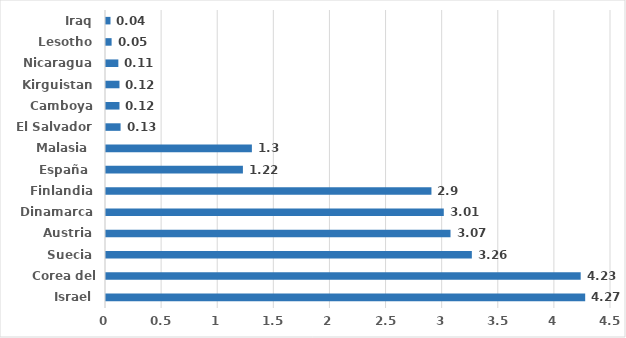
| Category | I+D/PIB |
|---|---|
| Israel | 4.27 |
| Corea del Sur | 4.23 |
| Suecia | 3.26 |
| Austria | 3.07 |
| Dinamarca | 3.01 |
| Finlandia | 2.9 |
| España  | 1.22 |
| Malasia  | 1.3 |
| El Salvador | 0.13 |
| Camboya | 0.12 |
| Kirguistan | 0.12 |
| Nicaragua | 0.11 |
| Lesotho | 0.05 |
| Iraq | 0.04 |